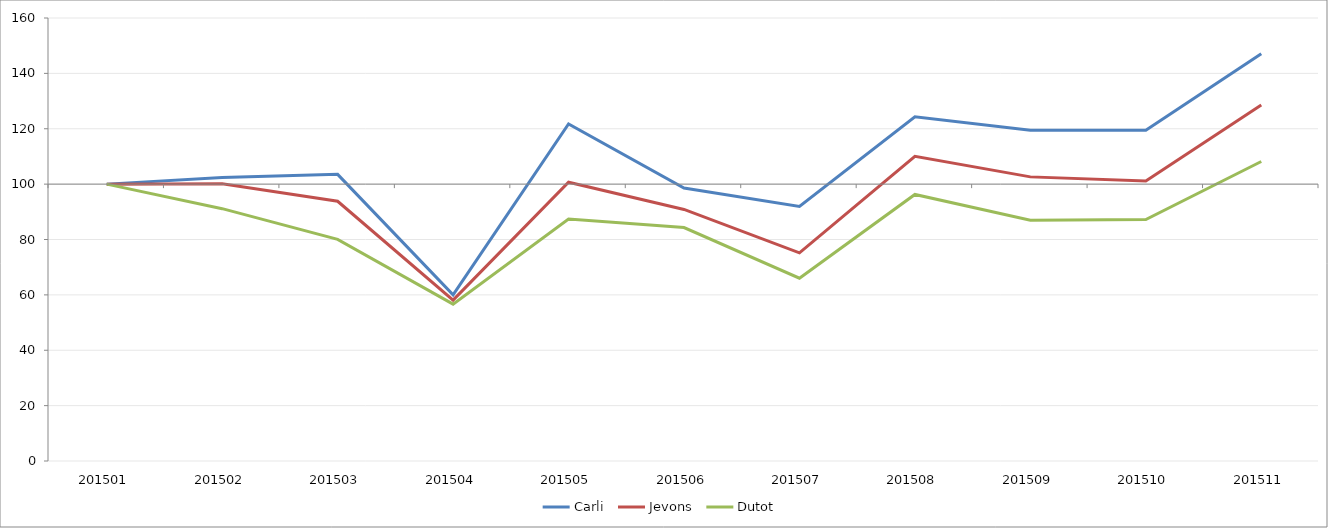
| Category | Carli | Jevons | Dutot |
|---|---|---|---|
| 201501.0 | 100 | 100 | 100 |
| 201502.0 | 102.367 | 100.093 | 91.139 |
| 201503.0 | 103.522 | 93.802 | 80.063 |
| 201504.0 | 59.998 | 58.108 | 56.646 |
| 201505.0 | 121.75 | 100.672 | 87.405 |
| 201506.0 | 98.565 | 90.853 | 84.304 |
| 201507.0 | 91.907 | 75.182 | 66.013 |
| 201508.0 | 124.355 | 110.055 | 96.266 |
| 201509.0 | 119.422 | 102.619 | 86.962 |
| 201510.0 | 119.42 | 101.112 | 87.215 |
| 201511.0 | 147.087 | 128.588 | 108.165 |